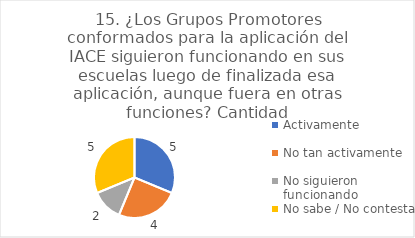
| Category | 15. ¿Los Grupos Promotores conformados para la aplicación del IACE siguieron funcionando en sus escuelas luego de finalizada esa aplicación, aunque fuera en otras funciones? |
|---|---|
| Activamente  | 0.312 |
| No tan activamente  | 0.25 |
| No siguieron funcionando  | 0.125 |
| No sabe / No contesta | 0.312 |